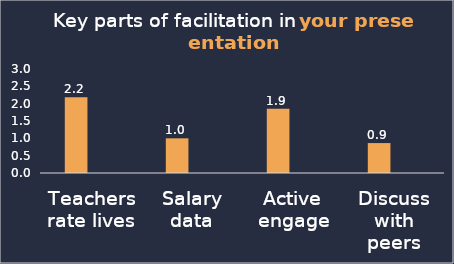
| Category | Your presentation | Series 1 |
|---|---|---|
| Teachers rate lives | 2.184 |  |
| Salary data | 1 |  |
| Active engage | 1.851 |  |
| Discuss with peers | 0.863 |  |